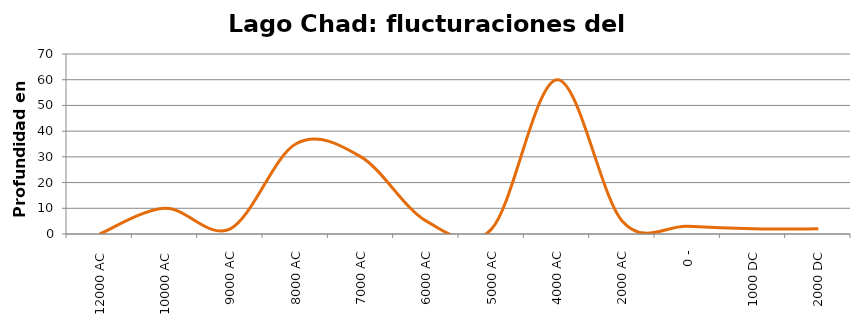
| Category | Profundidad |
|---|---|
| 12000 AC | 0 |
| 10000 AC | 10 |
| 9000 AC | 2 |
| 8000 AC | 35 |
| 7000 AC | 30 |
| 6000 AC | 5 |
| 5000 AC | 2 |
| 4000 AC | 60 |
| 2000 AC | 5 |
| 0 - | 3 |
| 1000 DC | 2 |
| 2000 DC | 2 |